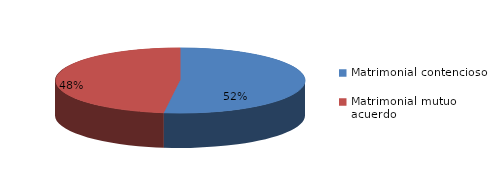
| Category | Series 0 |
|---|---|
| 0 | 836 |
| 1 | 770 |